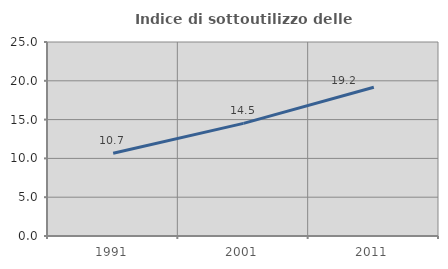
| Category | Indice di sottoutilizzo delle abitazioni  |
|---|---|
| 1991.0 | 10.657 |
| 2001.0 | 14.512 |
| 2011.0 | 19.166 |